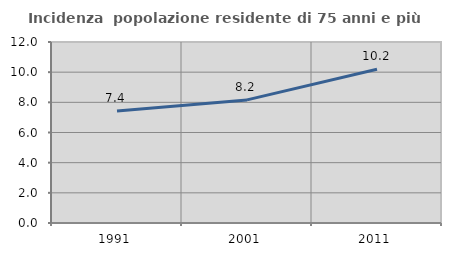
| Category | Incidenza  popolazione residente di 75 anni e più |
|---|---|
| 1991.0 | 7.422 |
| 2001.0 | 8.161 |
| 2011.0 | 10.19 |